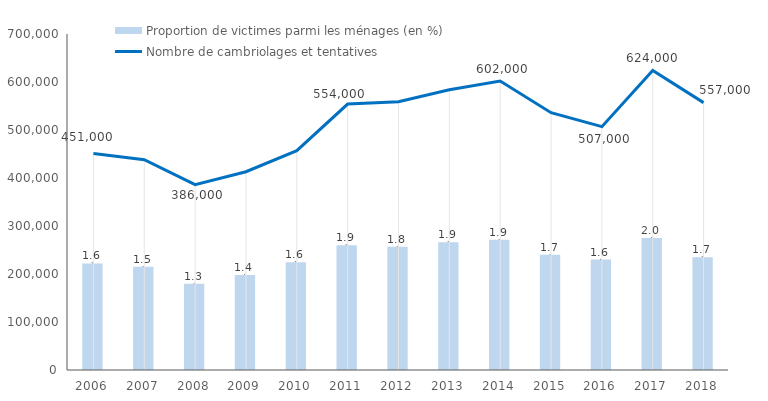
| Category | Proportion de victimes parmi les ménages (en %) |
|---|---|
| 2006.0 | 1.587 |
| 2007.0 | 1.535 |
| 2008.0 | 1.282 |
| 2009.0 | 1.415 |
| 2010.0 | 1.602 |
| 2011.0 | 1.856 |
| 2012.0 | 1.834 |
| 2013.0 | 1.902 |
| 2014.0 | 1.937 |
| 2015.0 | 1.715 |
| 2016.0 | 1.643 |
| 2017.0 | 1.964 |
| 2018.0 | 1.68 |